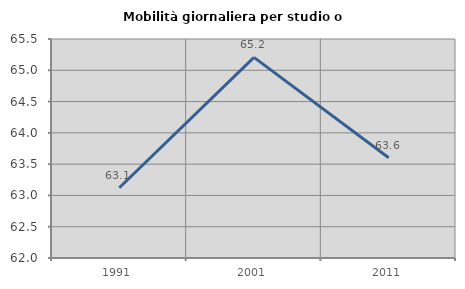
| Category | Mobilità giornaliera per studio o lavoro |
|---|---|
| 1991.0 | 63.122 |
| 2001.0 | 65.206 |
| 2011.0 | 63.602 |